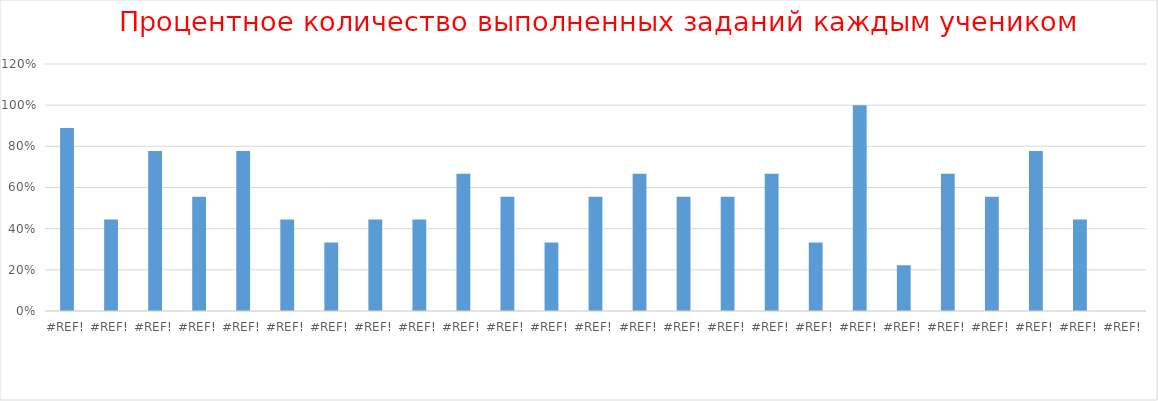
| Category | Series 0 |
|---|---|
| 0.0 | 0.889 |
| 0.0 | 0.444 |
| 0.0 | 0.778 |
| 0.0 | 0.556 |
| 0.0 | 0.778 |
| 0.0 | 0.444 |
| 0.0 | 0.333 |
| 0.0 | 0.444 |
| 0.0 | 0.444 |
| 0.0 | 0.667 |
| 0.0 | 0.556 |
| 0.0 | 0.333 |
| 0.0 | 0.556 |
| 0.0 | 0.667 |
| 0.0 | 0.556 |
| 0.0 | 0.556 |
| 0.0 | 0.667 |
| 0.0 | 0.333 |
| 0.0 | 1 |
| 0.0 | 0.222 |
| 0.0 | 0.667 |
| 0.0 | 0.556 |
| 0.0 | 0.778 |
| 0.0 | 0.444 |
| 0.0 | 0 |